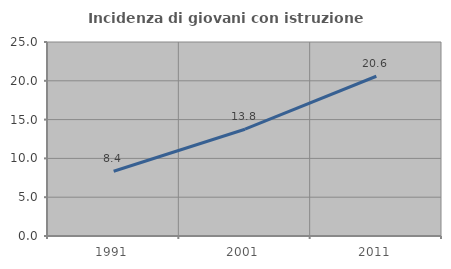
| Category | Incidenza di giovani con istruzione universitaria |
|---|---|
| 1991.0 | 8.351 |
| 2001.0 | 13.76 |
| 2011.0 | 20.588 |